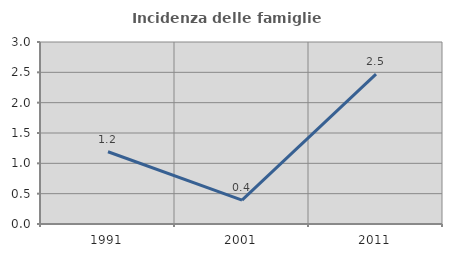
| Category | Incidenza delle famiglie numerose |
|---|---|
| 1991.0 | 1.19 |
| 2001.0 | 0.394 |
| 2011.0 | 2.469 |